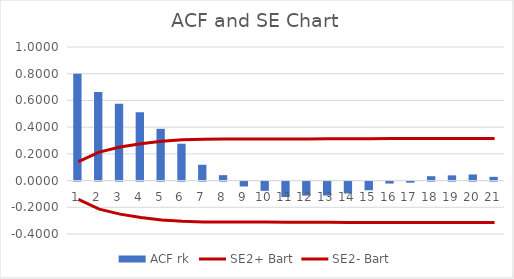
| Category | ACF rk |
|---|---|
| 0 | 0.8 |
| 1 | 0.663 |
| 2 | 0.575 |
| 3 | 0.511 |
| 4 | 0.388 |
| 5 | 0.276 |
| 6 | 0.118 |
| 7 | 0.04 |
| 8 | -0.037 |
| 9 | -0.07 |
| 10 | -0.115 |
| 11 | -0.105 |
| 12 | -0.105 |
| 13 | -0.089 |
| 14 | -0.065 |
| 15 | -0.015 |
| 16 | -0.008 |
| 17 | 0.033 |
| 18 | 0.039 |
| 19 | 0.046 |
| 20 | 0.028 |